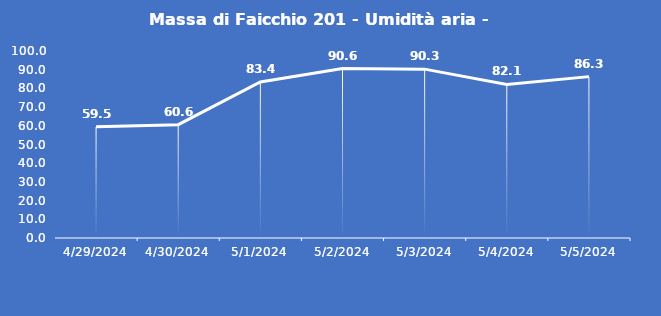
| Category | Massa di Faicchio 201 - Umidità aria - Grezzo (%) |
|---|---|
| 4/29/24 | 59.5 |
| 4/30/24 | 60.6 |
| 5/1/24 | 83.4 |
| 5/2/24 | 90.6 |
| 5/3/24 | 90.3 |
| 5/4/24 | 82.1 |
| 5/5/24 | 86.3 |